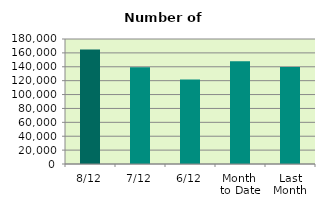
| Category | Series 0 |
|---|---|
| 8/12 | 164906 |
| 7/12 | 139180 |
| 6/12 | 121852 |
| Month 
to Date | 148091.333 |
| Last
Month | 139642.182 |